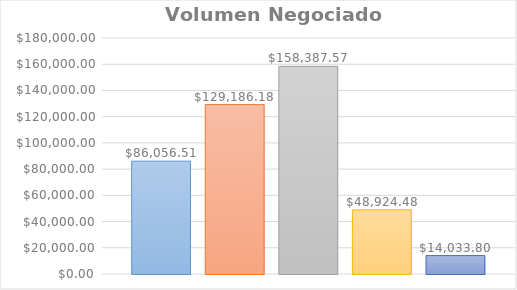
| Category | Lunes | Martes | Miercoles | Jueves | Viernes |
|---|---|---|---|---|---|
| 0 | 86056.51 | 129186.18 | 158387.57 | 48924.48 | 14033.8 |